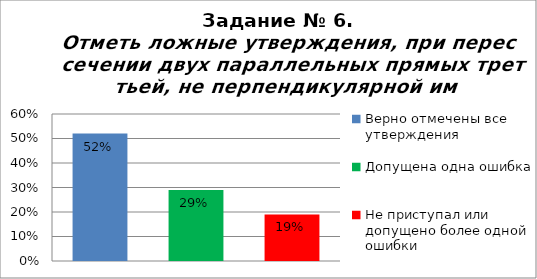
| Category | Отметь ложные утверждения, при пересечении двух параллельных прямых третьей, не перпендикулярной им. |
|---|---|
| Верно отмечены все утверждения | 0.52 |
| Допущена одна ошибка | 0.29 |
| Не приступал или допущено более одной ошибки | 0.19 |